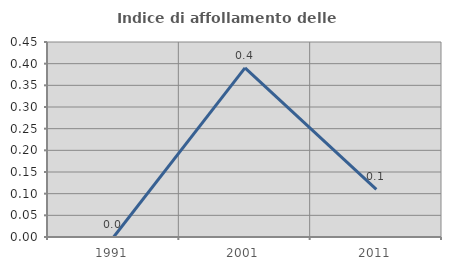
| Category | Indice di affollamento delle abitazioni  |
|---|---|
| 1991.0 | 0 |
| 2001.0 | 0.39 |
| 2011.0 | 0.11 |